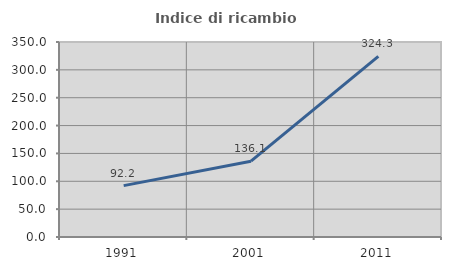
| Category | Indice di ricambio occupazionale  |
|---|---|
| 1991.0 | 92.179 |
| 2001.0 | 136.066 |
| 2011.0 | 324.348 |